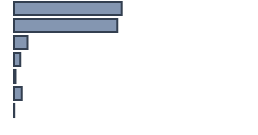
| Category | Percentatge |
|---|---|
| 0 | 44.878 |
| 1 | 43.027 |
| 2 | 5.607 |
| 3 | 2.576 |
| 4 | 0.618 |
| 5 | 3.211 |
| 6 | 0.084 |